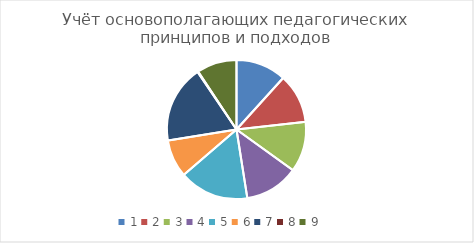
| Category | Series 0 |
|---|---|
| 0 | 0.215 |
| 1 | 0.211 |
| 2 | 0.215 |
| 3 | 0.23 |
| 4 | 0.297 |
| 5 | 0.161 |
| 6 | 0.331 |
| 7 | 0.003 |
| 8 | 0.17 |